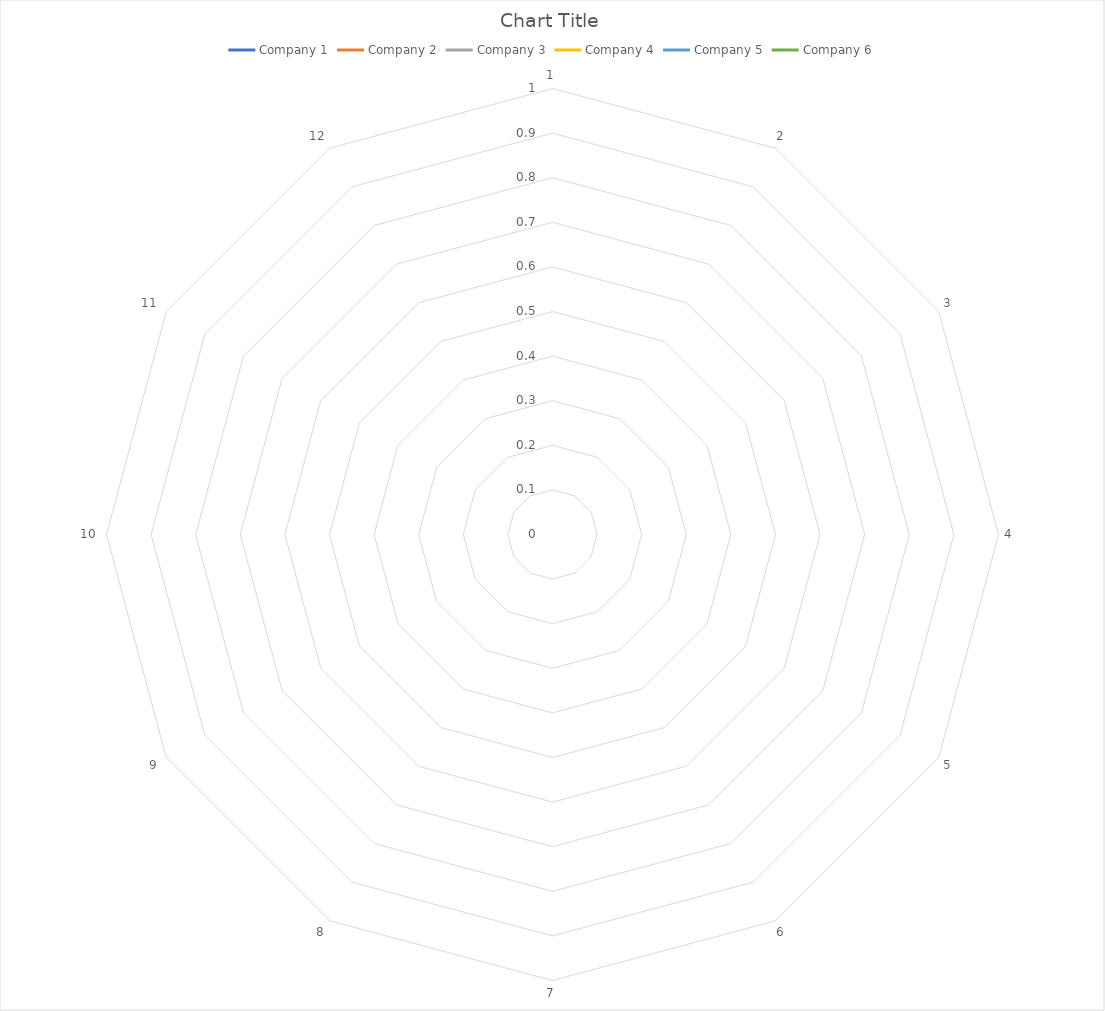
| Category | Company 1 | Company 2 | Company 3 | Company 4 | Company 5 | Company 6 |
|---|---|---|---|---|---|---|
| 0 | 0 | 0 | 0 | 0 | 0 | 0 |
| 1 | 0 | 0 | 0 | 0 | 0 | 0 |
| 2 | 0 | 0 | 0 | 0 | 0 | 0 |
| 3 | 0 | 0 | 0 | 0 | 0 | 0 |
| 4 | 0 | 0 | 0 | 0 | 0 | 0 |
| 5 | 0 | 0 | 0 | 0 | 0 | 0 |
| 6 | 0 | 0 | 0 | 0 | 0 | 0 |
| 7 | 0 | 0 | 0 | 0 | 0 | 0 |
| 8 | 0 | 0 | 0 | 0 | 0 | 0 |
| 9 | 0 | 0 | 0 | 0 | 0 | 0 |
| 10 | 0 | 0 | 0 | 0 | 0 | 0 |
| 11 | 0 | 0 | 0 | 0 | 0 | 0 |